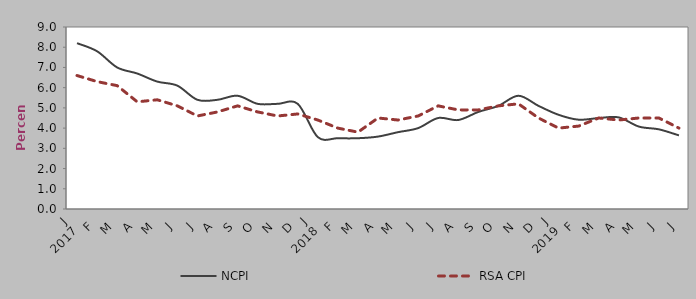
| Category | NCPI | RSA CPI |
|---|---|---|
| 0 | 8.2 | 6.6 |
| 1900-01-01 | 7.8 | 6.3 |
| 1900-01-02 | 7 | 6.1 |
| 1900-01-03 | 6.7 | 5.3 |
| 1900-01-04 | 6.3 | 5.4 |
| 1900-01-05 | 6.1 | 5.1 |
| 1900-01-06 | 5.4 | 4.6 |
| 1900-01-07 | 5.4 | 4.8 |
| 1900-01-08 | 5.6 | 5.1 |
| 1900-01-09 | 5.2 | 4.8 |
| 1900-01-10 | 5.2 | 4.6 |
| 1900-01-11 | 5.2 | 4.7 |
| 1900-01-12 | 3.555 | 4.4 |
| 1900-01-13 | 3.5 | 4 |
| 1900-01-14 | 3.5 | 3.8 |
| 1900-01-15 | 3.581 | 4.5 |
| 1900-01-16 | 3.8 | 4.4 |
| 1900-01-17 | 4 | 4.6 |
| 1900-01-18 | 4.5 | 5.1 |
| 1900-01-19 | 4.4 | 4.9 |
| 1900-01-20 | 4.8 | 4.9 |
| 1900-01-21 | 5.1 | 5.1 |
| 1900-01-22 | 5.6 | 5.2 |
| 1900-01-23 | 5.1 | 4.5 |
| 1900-01-24 | 4.658 | 4 |
| 1900-01-25 | 4.416 | 4.1 |
| 1900-01-26 | 4.498 | 4.5 |
| 1900-01-27 | 4.529 | 4.4 |
| 1900-01-28 | 4.076 | 4.5 |
| 1900-01-29 | 3.939 | 4.5 |
| 1900-01-30 | 3.639 | 4 |